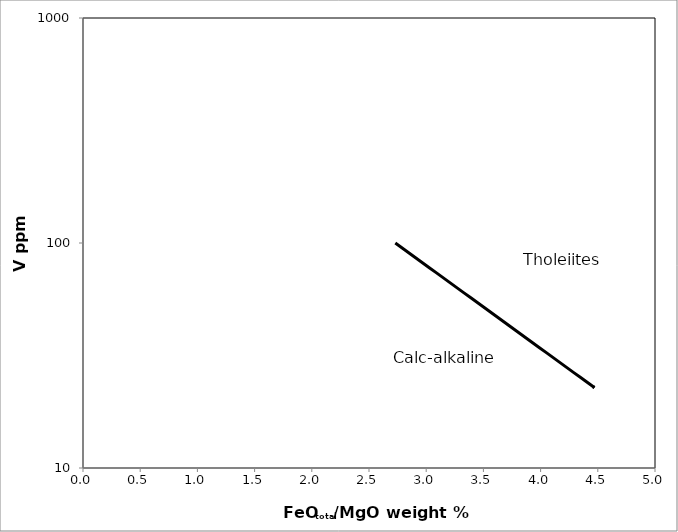
| Category | Series 0 |
|---|---|
| 2.73 | 100.006 |
| 2.79 | 95.032 |
| 2.85 | 90.306 |
| 2.91 | 85.815 |
| 2.97 | 81.547 |
| 3.0300000000000002 | 77.492 |
| 3.0900000000000003 | 73.638 |
| 3.1500000000000004 | 69.976 |
| 3.2100000000000004 | 66.495 |
| 3.2700000000000005 | 63.188 |
| 3.3300000000000005 | 60.046 |
| 3.3900000000000006 | 57.06 |
| 3.4500000000000006 | 54.222 |
| 3.5100000000000007 | 51.525 |
| 3.5700000000000007 | 48.963 |
| 3.630000000000001 | 46.528 |
| 3.690000000000001 | 44.214 |
| 3.750000000000001 | 42.015 |
| 3.810000000000001 | 39.925 |
| 3.870000000000001 | 37.94 |
| 3.930000000000001 | 36.053 |
| 3.990000000000001 | 34.26 |
| 4.050000000000001 | 32.556 |
| 4.11 | 30.937 |
| 4.17 | 29.398 |
| 4.2299999999999995 | 27.936 |
| 4.289999999999999 | 26.547 |
| 4.349999999999999 | 25.227 |
| 4.409999999999998 | 23.972 |
| 4.469999999999998 | 22.78 |
| 4.46 | 22.975 |